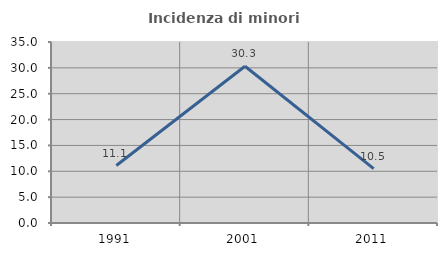
| Category | Incidenza di minori stranieri |
|---|---|
| 1991.0 | 11.111 |
| 2001.0 | 30.303 |
| 2011.0 | 10.526 |